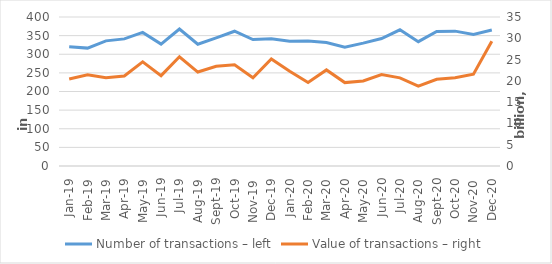
| Category | Number of transactions – left |
|---|---|
| sij.19 | 320078 |
| vlj.19 | 316492 |
| ožu.19 | 335948 |
| tra.19 | 341258 |
| svi.19 | 358577 |
| lip.19 | 327234 |
| srp.19 | 367649 |
| kol.19 | 326772 |
| ruj.19 | 344040 |
| lis.19 | 361767 |
| stu.19 | 339353 |
| pro.19 | 341408 |
| sij.20 | 334778 |
| Feb-20 | 335533 |
| ožu.20 | 331555 |
| tra.20 | 319128 |
| svi.20 | 329820 |
| lip.20 | 342182 |
| srp.20 | 365587 |
| kol.20 | 333814 |
| ruj.20 | 360919 |
| lis.20 | 362038 |
| stu.20 | 353021 |
| pro.20 | 364975 |